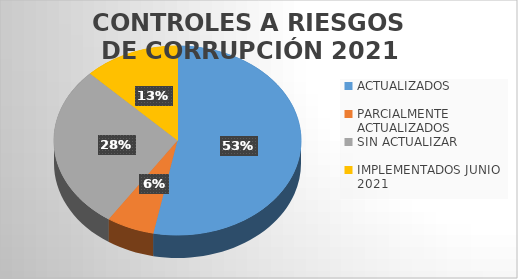
| Category | Series 0 |
|---|---|
| ACTUALIZADOS | 17 |
| PARCIALMENTE ACTUALIZADOS | 2 |
| SIN ACTUALIZAR | 9 |
| IMPLEMENTADOS JUNIO 2021 | 4 |